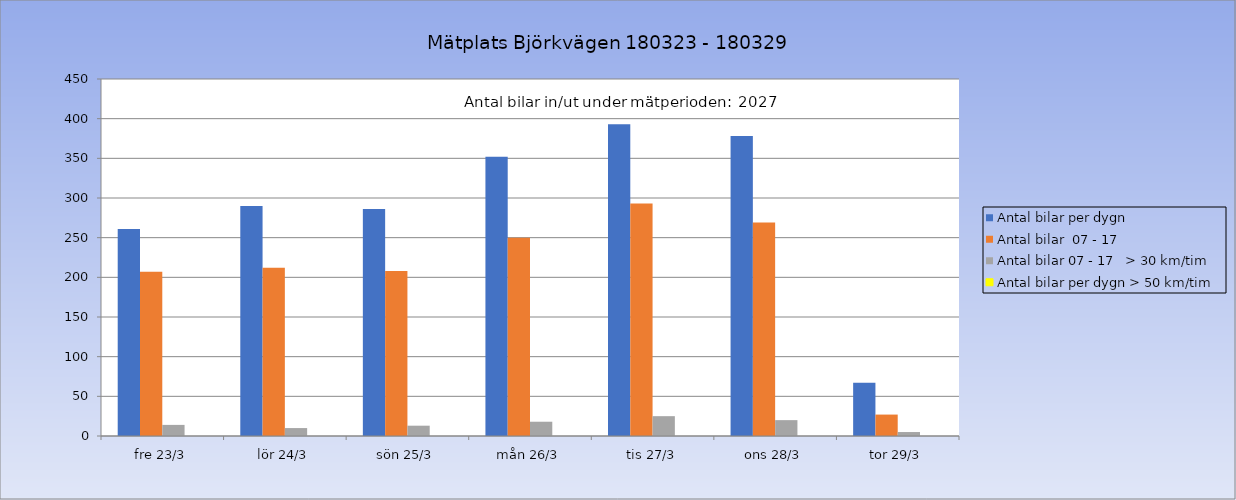
| Category | Antal bilar per dygn | Antal bilar  07 - 17 | Antal bilar 07 - 17   > 30 km/tim | Antal bilar per dygn > 50 km/tim |
|---|---|---|---|---|
| fre 23/3 | 261 | 207 | 14 | 0 |
| lör 24/3 | 290 | 212 | 10 | 0 |
| sön 25/3 | 286 | 208 | 13 | 0 |
| mån 26/3 | 352 | 250 | 18 | 0 |
| tis 27/3 | 393 | 293 | 25 | 0 |
| ons 28/3 | 378 | 269 | 20 | 0 |
| tor 29/3 | 67 | 27 | 5 | 0 |